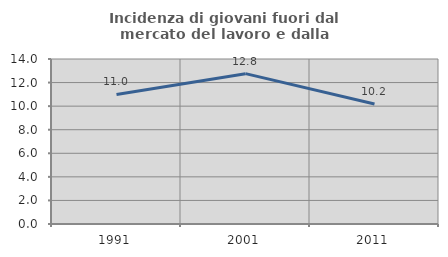
| Category | Incidenza di giovani fuori dal mercato del lavoro e dalla formazione  |
|---|---|
| 1991.0 | 10.992 |
| 2001.0 | 12.757 |
| 2011.0 | 10.185 |